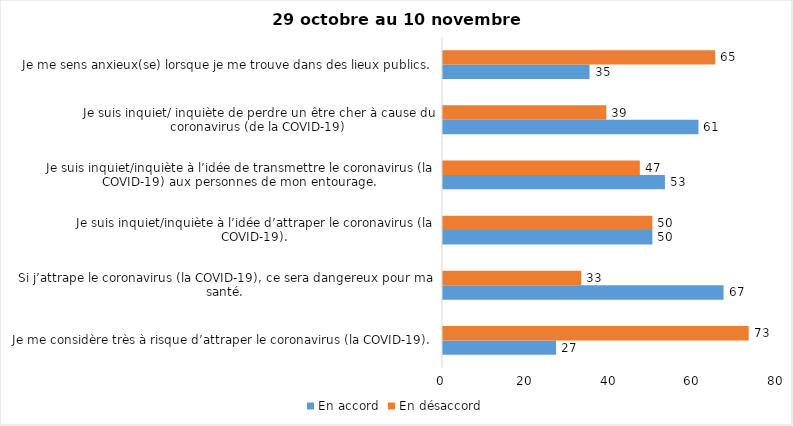
| Category | En accord | En désaccord |
|---|---|---|
| Je me considère très à risque d’attraper le coronavirus (la COVID-19). | 27 | 73 |
| Si j’attrape le coronavirus (la COVID-19), ce sera dangereux pour ma santé. | 67 | 33 |
| Je suis inquiet/inquiète à l’idée d’attraper le coronavirus (la COVID-19). | 50 | 50 |
| Je suis inquiet/inquiète à l’idée de transmettre le coronavirus (la COVID-19) aux personnes de mon entourage. | 53 | 47 |
| Je suis inquiet/ inquiète de perdre un être cher à cause du coronavirus (de la COVID-19) | 61 | 39 |
| Je me sens anxieux(se) lorsque je me trouve dans des lieux publics. | 35 | 65 |